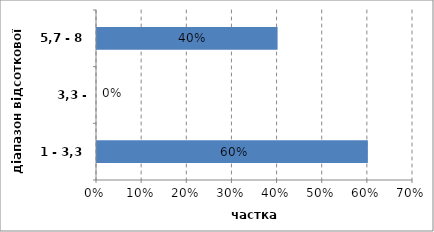
| Category | Series 0 |
|---|---|
| 1 - 3,3 | 0.6 |
| 3,3 - 5,7 | 0 |
| 5,7 - 8 | 0.4 |